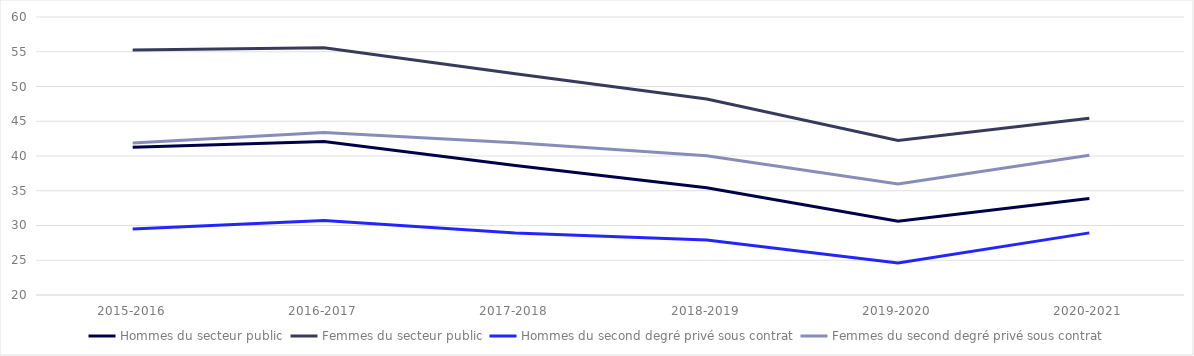
| Category | Hommes du secteur public | Femmes du secteur public | Hommes du second degré privé sous contrat | Femmes du second degré privé sous contrat |
|---|---|---|---|---|
| 2015-2016 | 41.26 | 55.24 | 29.5 | 41.88 |
| 2016-2017 | 42.1 | 55.58 | 30.73 | 43.38 |
| 2017-2018 | 38.63 | 51.83 | 28.93 | 41.89 |
| 2018-2019 | 35.43 | 48.19 | 27.92 | 40.04 |
| 2019-2020 | 30.62 | 42.22 | 24.61 | 35.97 |
| 2020-2021 | 33.88 | 45.42 | 28.94 | 40.1 |